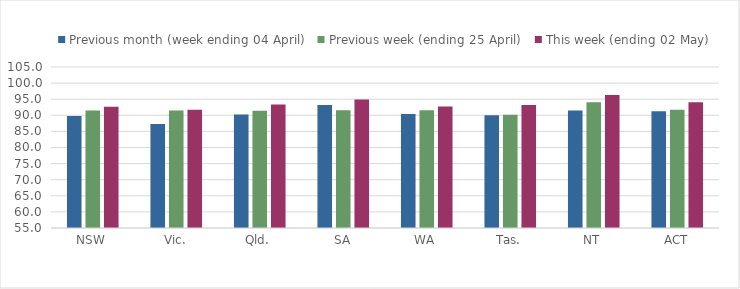
| Category | Previous month (week ending 04 April) | Previous week (ending 25 April) | This week (ending 02 May) |
|---|---|---|---|
| NSW | 89.768 | 91.458 | 92.637 |
| Vic. | 87.297 | 91.48 | 91.76 |
| Qld. | 90.247 | 91.415 | 93.357 |
| SA | 93.235 | 91.577 | 94.931 |
| WA | 90.413 | 91.585 | 92.694 |
| Tas. | 90.037 | 90.148 | 93.236 |
| NT | 91.468 | 94.083 | 96.324 |
| ACT | 91.239 | 91.697 | 94.064 |